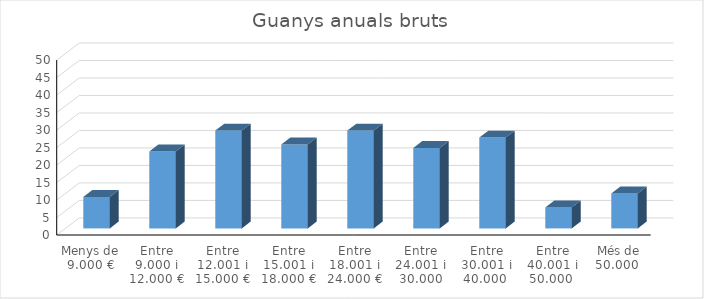
| Category | Series 0 |
|---|---|
| Menys de 9.000 € | 9 |
| Entre 9.000 i 12.000 € | 22 |
| Entre 12.001 i 15.000 € | 28 |
| Entre 15.001 i 18.000 € | 24 |
| Entre 18.001 i 24.000 € | 28 |
| Entre 24.001 i 30.000 | 23 |
| Entre 30.001 i 40.000  | 26 |
| Entre 40.001 i 50.000  | 6 |
| Més de 50.000  | 10 |